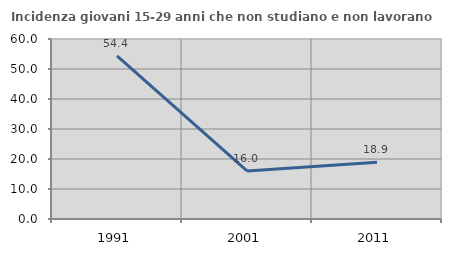
| Category | Incidenza giovani 15-29 anni che non studiano e non lavorano  |
|---|---|
| 1991.0 | 54.396 |
| 2001.0 | 16.009 |
| 2011.0 | 18.891 |